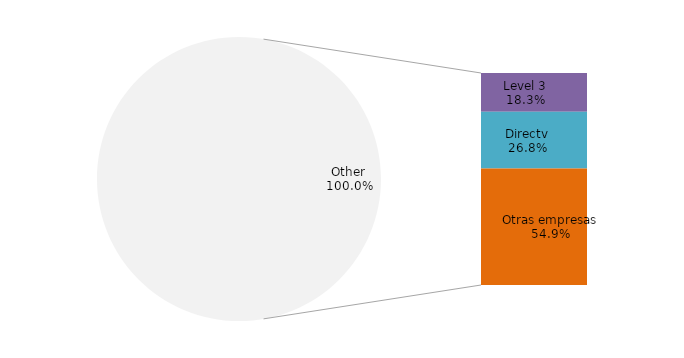
| Category | Series 0 |
|---|---|
| Grupo Telefónica | 0 |
| Grupo Claro | 0 |
| Grupo Entel | 0 |
| Bitel | 0 |
| Level 3 | 184.567 |
| Directv | 270.369 |
| Otras empresas | 553.709 |